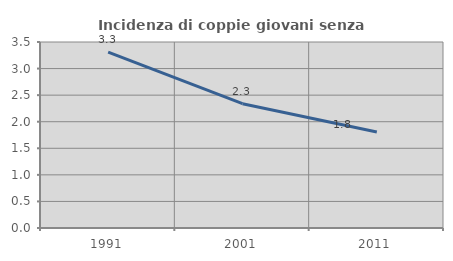
| Category | Incidenza di coppie giovani senza figli |
|---|---|
| 1991.0 | 3.311 |
| 2001.0 | 2.339 |
| 2011.0 | 1.807 |